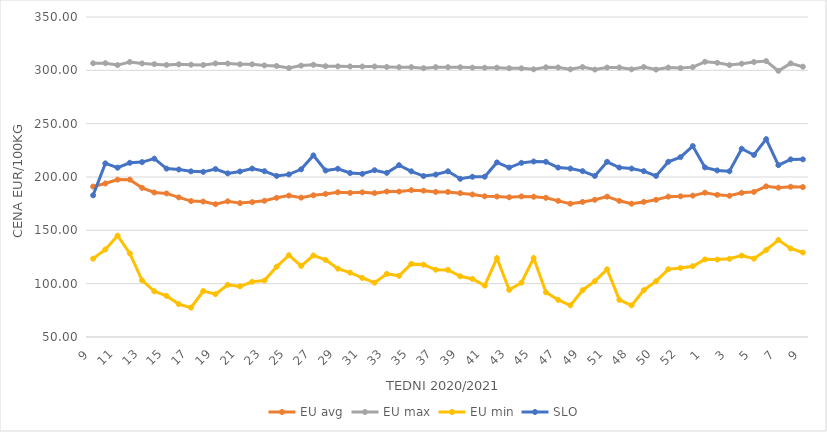
| Category | EU avg | EU max | EU min | SLO |
|---|---|---|---|---|
| 9.0 | 191.052 | 306.62 | 123.433 | 182.84 |
| 10.0 | 193.933 | 306.73 | 132.064 | 212.78 |
| 11.0 | 197.552 | 304.92 | 145.006 | 208.73 |
| 12.0 | 197.533 | 307.82 | 128.293 | 213.32 |
| 13.0 | 189.839 | 306.44 | 103.04 | 213.96 |
| 14.0 | 185.504 | 305.8 | 92.836 | 217.19 |
| 15.0 | 184.591 | 305.08 | 88.508 | 207.87 |
| 16.0 | 180.892 | 305.63 | 80.873 | 207.05 |
| 17.0 | 177.437 | 305.27 | 77.506 | 205.29 |
| 18.0 | 176.995 | 305.01 | 93.104 | 204.82 |
| 19.0 | 174.49 | 306.49 | 90.169 | 207.44 |
| 20.0 | 177.204 | 306.38 | 98.928 | 203.41 |
| 21.0 | 175.519 | 305.66 | 97.454 | 205.19 |
| 22.0 | 176.473 | 305.64 | 101.792 | 207.91 |
| 23.0 | 177.741 | 304.59 | 102.918 | 205.46 |
| 24.0 | 180.501 | 304.1 | 115.936 | 201 |
| 25.0 | 182.568 | 302.13 | 126.655 | 202.43 |
| 26.0 | 180.667 | 304.43 | 116.597 | 207.19 |
| 27.0 | 182.833 | 305.22 | 126.397 | 220.25 |
| 28.0 | 184.121 | 303.88 | 122.317 | 206.06 |
| 29.0 | 185.712 | 303.73 | 114.082 | 207.73 |
| 30.0 | 185.141 | 303.63 | 110.314 | 203.73 |
| 31.0 | 185.621 | 303.57 | 105.336 | 203 |
| 32.0 | 184.887 | 303.58 | 100.908 | 206.36 |
| 33.0 | 186.411 | 303.17 | 109.191 | 203.88 |
| 34.0 | 186.338 | 302.96 | 107.355 | 211.07 |
| 35.0 | 187.628 | 302.99 | 118.534 | 205.34 |
| 36.0 | 187.19 | 302.05 | 117.814 | 200.88 |
| 37.0 | 186.038 | 302.98 | 113.058 | 202.29 |
| 38.0 | 185.986 | 302.94 | 112.896 | 205.33 |
| 39.0 | 184.836 | 302.88 | 106.953 | 198.33 |
| 40.0 | 183.595 | 302.56 | 104.426 | 200.21 |
| 41.0 | 181.893 | 302.44 | 98.23 | 200.3 |
| 42.0 | 181.671 | 302.52 | 123.908 | 213.66 |
| 43.0 | 181.023 | 302.01 | 94.177 | 208.86 |
| 44.0 | 181.795 | 301.86 | 100.908 | 213.25 |
| 45.0 | 181.489 | 300.98 | 124 | 214.51 |
| 46.0 | 180.473 | 302.82 | 91.889 | 214.27 |
| 47.0 | 177.656 | 302.7 | 84.832 | 208.87 |
| 48.0 | 174.977 | 300.94 | 79.697 | 207.9 |
| 49.0 | 176.65 | 303.09 | 93.873 | 205.48 |
| 50.0 | 178.648 | 300.7 | 102.316 | 200.99 |
| 51.0 | 181.58 | 302.62 | 113.46 | 214.25 |
| 47.0 | 177.656 | 302.7 | 84.832 | 208.87 |
| 48.0 | 174.977 | 300.94 | 79.697 | 207.9 |
| 49.0 | 176.65 | 303.09 | 93.873 | 205.48 |
| 50.0 | 178.648 | 300.7 | 102.316 | 200.99 |
| 51.0 | 181.58 | 302.62 | 113.46 | 214.25 |
| 52.0 | 181.9 | 302.14 | 114.76 | 218.61 |
| 53.0 | 182.536 | 303 | 116.375 | 229 |
| 1.0 | 185.3 | 308 | 122.769 | 209 |
| 2.0 | 183.25 | 307.1 | 122.609 | 206.15 |
| 3.0 | 182.393 | 304.91 | 123.32 | 205.35 |
| 4.0 | 185.158 | 306.22 | 126.329 | 226.48 |
| 5.0 | 186.04 | 307.79 | 123.461 | 220.65 |
| 6.0 | 191.206 | 308.7 | 131.528 | 235.46 |
| 7.0 | 190.028 | 299.55 | 140.902 | 211.1 |
| 8.0 | 190.875 | 306.55 | 132.97 | 216.51 |
| 9.0 | 190.519 | 303.4 | 129.173 | 216.54 |